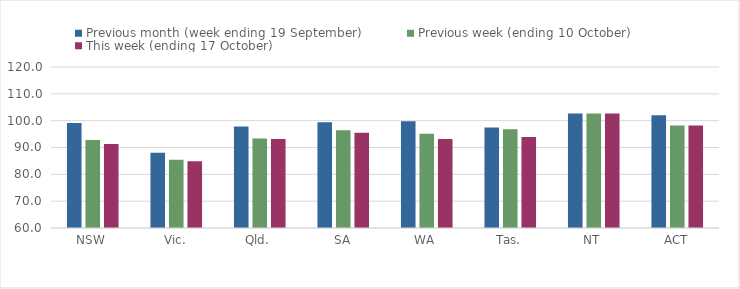
| Category | Previous month (week ending 19 September) | Previous week (ending 10 October) | This week (ending 17 October) |
|---|---|---|---|
| NSW | 99.13 | 92.8 | 91.34 |
| Vic. | 88.02 | 85.42 | 84.91 |
| Qld. | 97.87 | 93.34 | 93.16 |
| SA | 99.39 | 96.47 | 95.48 |
| WA | 99.82 | 95.12 | 93.13 |
| Tas. | 97.41 | 96.82 | 93.94 |
| NT | 102.64 | 102.64 | 102.64 |
| ACT | 102.02 | 98.2 | 98.21 |